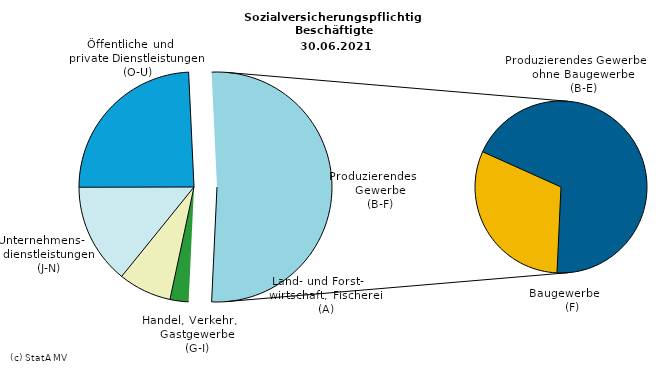
| Category | Series 0 |
|---|---|
| 0 | 15072 |
| 1 | 43151 |
| 2 | 81712 |
| 3 | 140330 |
| 4 | 92171 |
| 5 | 205333 |